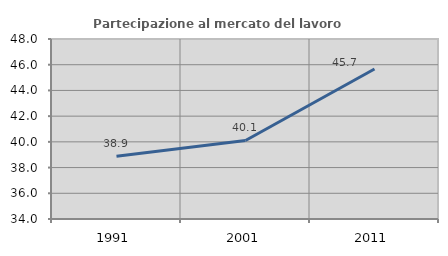
| Category | Partecipazione al mercato del lavoro  femminile |
|---|---|
| 1991.0 | 38.879 |
| 2001.0 | 40.11 |
| 2011.0 | 45.665 |